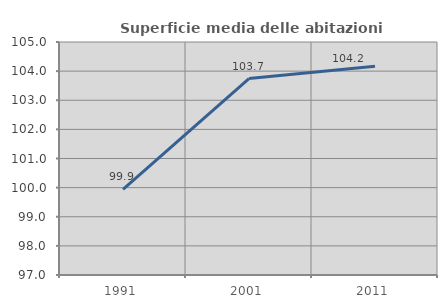
| Category | Superficie media delle abitazioni occupate |
|---|---|
| 1991.0 | 99.943 |
| 2001.0 | 103.746 |
| 2011.0 | 104.17 |